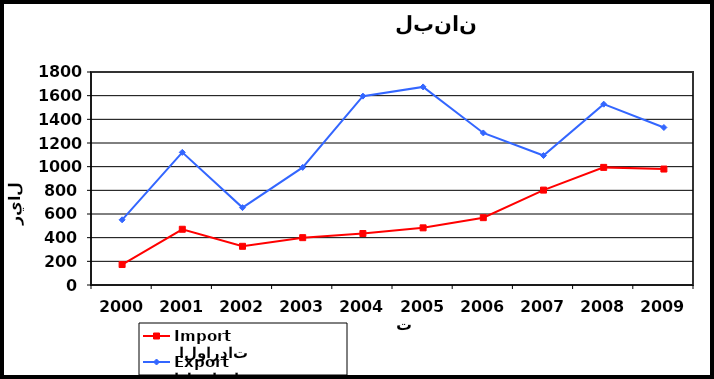
| Category |  الواردات           Import | الصادرات          Export |
|---|---|---|
| 2000.0 | 173 | 551 |
| 2001.0 | 471 | 1121 |
| 2002.0 | 327 | 654 |
| 2003.0 | 400 | 994 |
| 2004.0 | 435 | 1596 |
| 2005.0 | 483 | 1674 |
| 2006.0 | 569 | 1285 |
| 2007.0 | 802 | 1094 |
| 2008.0 | 994 | 1528 |
| 2009.0 | 980 | 1331 |